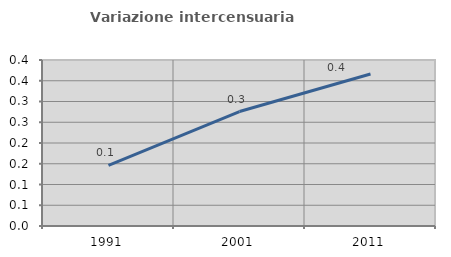
| Category | Variazione intercensuaria annua |
|---|---|
| 1991.0 | 0.146 |
| 2001.0 | 0.276 |
| 2011.0 | 0.366 |